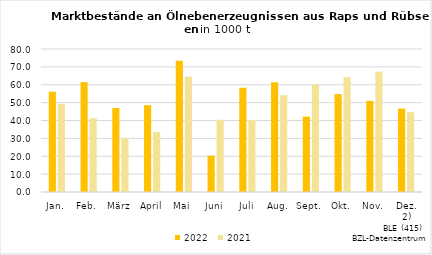
| Category | 2022 | 2021 |
|---|---|---|
| Jan. | 56.101 | 49.409 |
| Feb. | 61.468 | 41.214 |
| März | 47.037 | 30.085 |
| April | 48.589 | 33.612 |
| Mai | 73.378 | 64.55 |
| Juni | 20.297 | 40.424 |
| Juli | 58.311 | 40.273 |
| Aug. | 61.409 | 54.135 |
| Sept. | 42.2 | 60.095 |
| Okt. | 54.8 | 64.292 |
| Nov. | 51.025 | 67.375 |
| Dez. 2) | 46.671 | 44.642 |